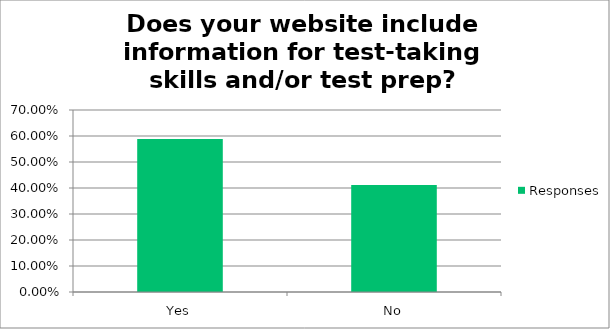
| Category | Responses |
|---|---|
| Yes | 0.588 |
| No | 0.412 |